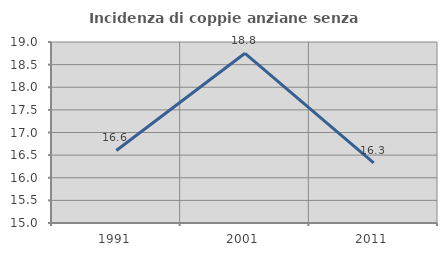
| Category | Incidenza di coppie anziane senza figli  |
|---|---|
| 1991.0 | 16.602 |
| 2001.0 | 18.75 |
| 2011.0 | 16.327 |